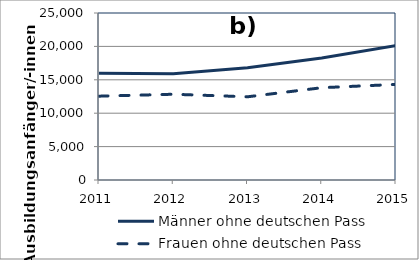
| Category | Männer ohne deutschen Pass | Frauen ohne deutschen Pass |
|---|---|---|
| 2011.0 | 15999 | 12549 |
| 2012.0 | 15897 | 12837 |
| 2013.0 | 16797 | 12456 |
| 2014.0 | 18252 | 13815 |
| 2015.0 | 20121 | 14310 |